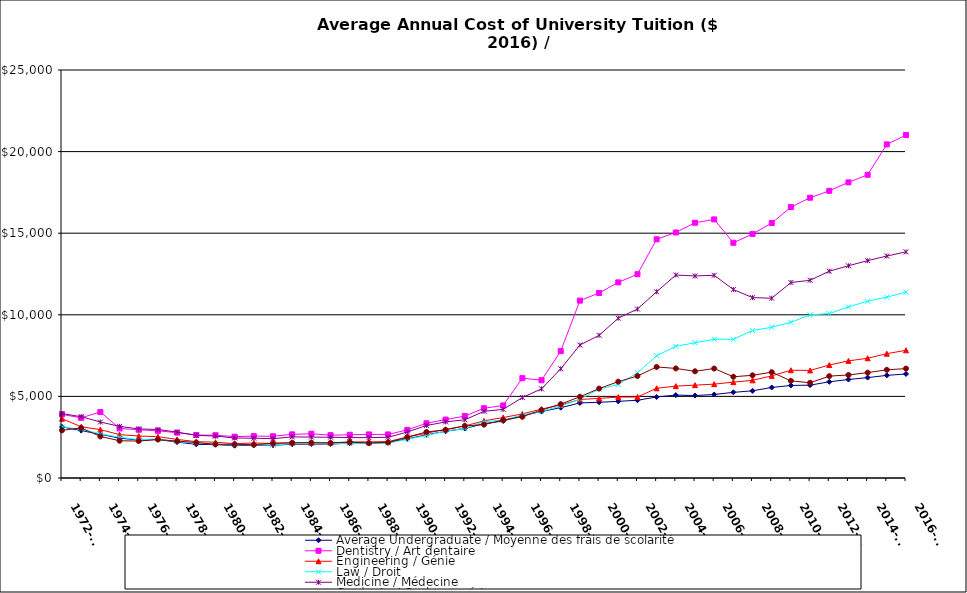
| Category | Average Undergraduate / Moyenne des frais de scolarité | Dentistry / Art dentaire | Engineering / Génie | Law / Droit | Medicine / Médecine | Graduate / Cycles supérieurs |
|---|---|---|---|---|---|---|
| 1972-73 | 3130.849 | 3893.041 | 3635.068 | 3142.575 | 3951.671 | 2923.375 |
| 1973-74 | 2905.322 | 3688.78 | 3139.271 | 2976.051 | 3754.068 | 3068.385 |
| 1974-75 | 2680.718 | 4043.13 | 2964.962 | 2705.221 | 3430.534 | 2546.202 |
| 1975-76 | 2439.6 | 3037.324 | 2656.552 | 2501.586 | 3165.724 | 2282.388 |
| 1976-77 | 2328.54 | 2956.09 | 2572.129 | 2345.055 | 3005.633 | 2264.656 |
| 1977-78 | 2357.821 | 2889 | 2533.607 | 2388.393 | 2973.071 | 2355.913 |
| 1978-79 | 2199.639 | 2778.492 | 2364.525 | 2231.213 | 2810.066 | 2262.181 |
| 1979-80 | 2060.82 | 2632.2 | 2227.74 | 2131.44 | 2616.15 | 2174.672 |
| 1980-81 | 2048.564 | 2620.527 | 2191.555 | 2086.5 | 2570.918 | 2059.834 |
| 1981-82 | 1979.176 | 2531.685 | 2103.685 | 2015.491 | 2451.273 | 2070.957 |
| 1982-83 | 2018.383 | 2568 | 2147.016 | 2060.481 | 2439.366 | 2033.228 |
| 1983-84 | 2006.664 | 2556.95 | 2117.164 | 2017.714 | 2406.671 | 2134.856 |
| 1984-85 | 2070.079 | 2673.941 | 2146.356 | 2103.98 | 2519.267 | 2157.286 |
| 1985-86 | 2076.819 | 2712.705 | 2146.114 | 2129.81 | 2504.819 | 2166.662 |
| 1986-87 | 2080.628 | 2622.805 | 2141.305 | 2123.689 | 2499.494 | 2152.659 |
| 1987-88 | 2131.253 | 2650.476 | 2208.105 | 2103.136 | 2476.152 | 2202.274 |
| 1988-89 | 2136.994 | 2670.792 | 2212.736 | 2115.354 | 2470.618 | 2140.794 |
| 1989-90 | 2181.77 | 2669.278 | 2231.551 | 2133.706 | 2494.187 | 2177.304 |
| 1990-91 | 2397.673 | 2947.959 | 2509.041 | 2378.02 | 2816.939 | 2504.655 |
| 1991-92 | 2645.536 | 3352.667 | 2749.435 | 2605.217 | 3216.203 | 2820.876 |
| 1992-93 | 2861.486 | 3581.443 | 2977.657 | 2876.771 | 3436.229 | 2952.839 |
| 1993-94 | 3034.5 | 3795 | 3192 | 3031.5 | 3570 | 3193.713 |
| 1994-95 | 3327.613 | 4273.008 | 3499.911 | 3453.466 | 4084.229 | 3268.788 |
| 1995-96 | 3494.356 | 4445.63 | 3705.425 | 3548.589 | 4206.712 | 3551.671 |
| 1996-97 | 3824.558 | 6118.137 | 3925.66 | 3862.11 | 4932.351 | 3751.475 |
| 1997-98 | 4074.996 | 5991.053 | 4221.292 | 4084.938 | 5462.681 | 4170.048 |
| 1998-99 | 4309.065 | 7774.318 | 4479.233 | 4406.103 | 6691.426 | 4527.739 |
| 1999-00 | 4599.733 | 10867.699 | 4811.199 | 4830.549 | 8146.282 | 4977.299 |
| 2000-01 | 4639.358 | 11337.962 | 4877.585 | 5442.868 | 8740.352 | 5477.803 |
| 2001-02 | 4696.184 | 11986.626 | 4957.448 | 5732.049 | 9791.485 | 5904.05 |
| 2002-03 | 4764.924 | 12488.184 | 4962.66 | 6449.532 | 10352.892 | 6249.249 |
| 2003-04 | 4964.883 | 14626.109 | 5495.72 | 7490.416 | 11412.362 | 6804.7 |
| 2004-05 | 5079.587 | 15043.771 | 5630.223 | 8068.229 | 12434.074 | 6714.231 |
| 2005-06 | 5053.2 | 15639.6 | 5688 | 8284.8 | 12381.6 | 6537.6 |
| 2006-07 | 5115.993 | 15844.631 | 5751.52 | 8498.409 | 12419.846 | 6707.164 |
| 2007-08 | 5248.854 | 14413.044 | 5871.853 | 8500.886 | 11549.091 | 6203.505 |
| 2008-09 | 5341.935 | 14955.618 | 5985.623 | 9036.389 | 11051.853 | 6292.838 |
| 2009-10 | 5546.79 | 15620.129 | 6259.5 | 9236.045 | 11016.136 | 6483.976 |
| 2010-11 | 5671.643 | 16600.522 | 6604.058 | 9541.277 | 11977.02 | 5952.69 |
| 2011-12 | 5689.651 | 17173.902 | 6591.343 | 9996.781 | 12115.006 | 5836.364 |
| 2012-13 | 5893.528 | 17596.181 | 6921.15 | 10074.705 | 12673.302 | 6241.696 |
| 2013-14 | 6035.218 | 18114.02 | 7177.016 | 10487.394 | 13005.205 | 6313.349 |
| 2014-15 | 6151.304 | 18581.08 | 7335.824 | 10832.981 | 13318.936 | 6455.895 |
| 2015-16 | 6289.166 | 20442.578 | 7617.791 | 11083.374 | 13599.649 | 6629.943 |
| 2016-17 | 6373 | 21012 | 7825 | 11385 | 13858 | 6703 |